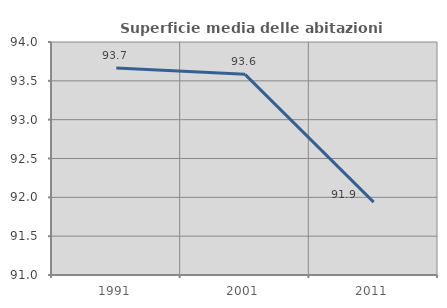
| Category | Superficie media delle abitazioni occupate |
|---|---|
| 1991.0 | 93.664 |
| 2001.0 | 93.583 |
| 2011.0 | 91.938 |